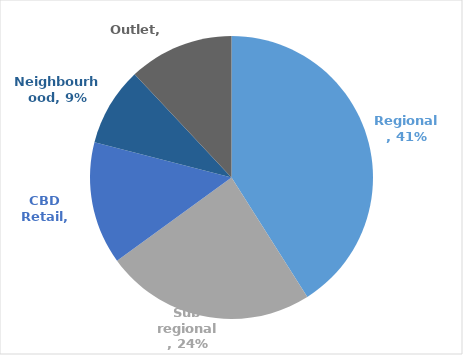
| Category | Series 0 |
|---|---|
| Regional | 0.41 |
| Sub regional | 0.24 |
| CBD Retail | 0.14 |
| Neighbourhood | 0.09 |
| Outlet | 0.12 |